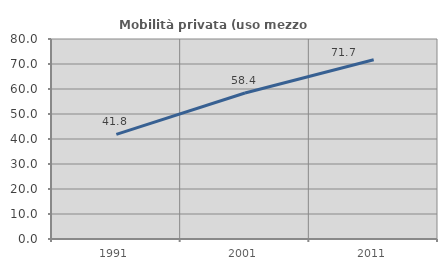
| Category | Mobilità privata (uso mezzo privato) |
|---|---|
| 1991.0 | 41.832 |
| 2001.0 | 58.419 |
| 2011.0 | 71.683 |